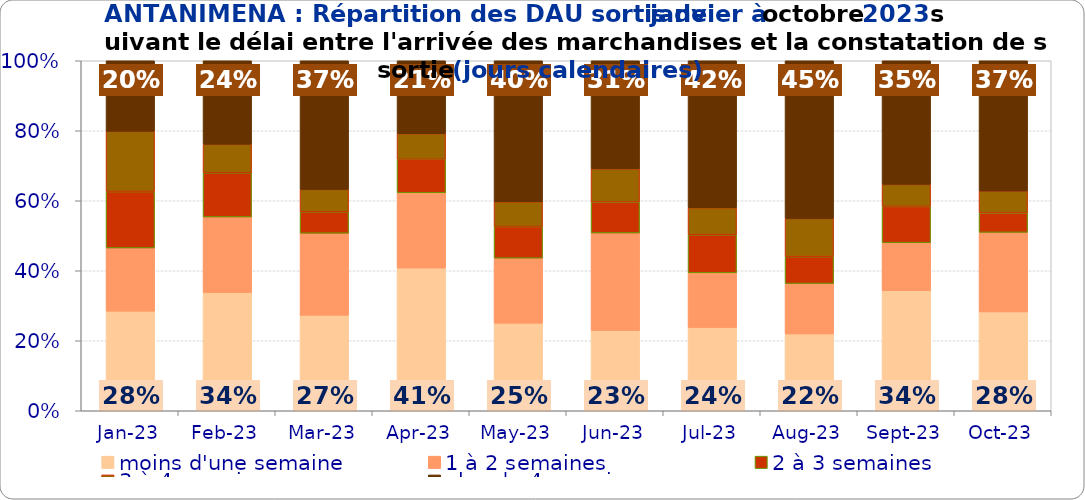
| Category | moins d'une semaine | 1 à 2 semaines | 2 à 3 semaines | 3 à 4 semaines | plus de 4 semaines |
|---|---|---|---|---|---|
| 2023-01-01 | 0.285 | 0.181 | 0.161 | 0.172 | 0.201 |
| 2023-02-01 | 0.338 | 0.216 | 0.126 | 0.082 | 0.238 |
| 2023-03-01 | 0.273 | 0.235 | 0.061 | 0.064 | 0.368 |
| 2023-04-01 | 0.408 | 0.215 | 0.096 | 0.073 | 0.208 |
| 2023-05-01 | 0.25 | 0.186 | 0.09 | 0.071 | 0.403 |
| 2023-06-01 | 0.229 | 0.279 | 0.088 | 0.095 | 0.308 |
| 2023-07-01 | 0.238 | 0.156 | 0.109 | 0.077 | 0.42 |
| 2023-08-01 | 0.22 | 0.144 | 0.077 | 0.109 | 0.451 |
| 2023-09-01 | 0.343 | 0.137 | 0.104 | 0.063 | 0.353 |
| 2023-10-01 | 0.282 | 0.227 | 0.056 | 0.063 | 0.372 |